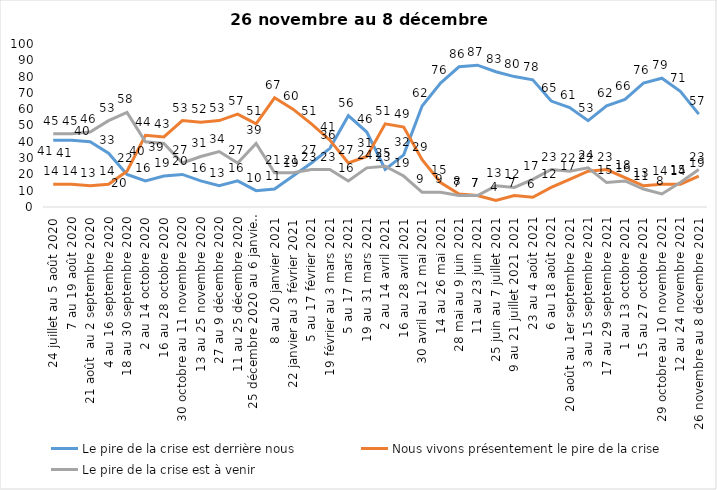
| Category | Le pire de la crise est derrière nous | Nous vivons présentement le pire de la crise | Le pire de la crise est à venir |
|---|---|---|---|
| 24 juillet au 5 août 2020 | 41 | 14 | 45 |
| 7 au 19 août 2020 | 41 | 14 | 45 |
| 21 août  au 2 septembre 2020 | 40 | 13 | 46 |
| 4 au 16 septembre 2020 | 33 | 14 | 53 |
| 18 au 30 septembre 2020 | 20 | 22 | 58 |
| 2 au 14 octobre 2020 | 16 | 44 | 40 |
| 16 au 28 octobre 2020 | 19 | 43 | 39 |
| 30 octobre au 11 novembre 2020 | 20 | 53 | 27 |
| 13 au 25 novembre 2020 | 16 | 52 | 31 |
| 27 au 9 décembre 2020 | 13 | 53 | 34 |
| 11 au 25 décembre 2020 | 16 | 57 | 27 |
| 25 décembre 2020 au 6 janvier 2021 | 10 | 51 | 39 |
| 8 au 20 janvier 2021 | 11 | 67 | 21 |
| 22 janvier au 3 février 2021 | 19 | 60 | 21 |
| 5 au 17 février 2021 | 27 | 51 | 23 |
| 19 février au 3 mars 2021 | 36 | 41 | 23 |
| 5 au 17 mars 2021 | 56 | 27 | 16 |
| 19 au 31 mars 2021 | 46 | 31 | 24 |
| 2 au 14 avril 2021 | 23 | 51 | 25 |
| 16 au 28 avril 2021 | 32 | 49 | 19 |
| 30 avril au 12 mai 2021 | 62 | 29 | 9 |
| 14 au 26 mai 2021 | 76 | 15 | 9 |
| 28 mai au 9 juin 2021 | 86 | 8 | 7 |
| 11 au 23 juin 2021 | 87 | 7 | 7 |
| 25 juin au 7 juillet 2021 | 83 | 4 | 13 |
| 9 au 21 juillet 2021 2021 | 80 | 7 | 12 |
| 23 au 4 août 2021 | 78 | 6 | 17 |
| 6 au 18 août 2021 | 65 | 12 | 23 |
| 20 août au 1er septembre 2021 | 61 | 17 | 22 |
| 3 au 15 septembre 2021 | 53 | 22 | 24 |
| 17 au 29 septembre 2021 | 62 | 23 | 15 |
| 1 au 13 octobre 2021 | 66 | 18 | 16 |
| 15 au 27 octobre 2021 | 76 | 13 | 11 |
| 29 octobre au 10 novembre 2021 | 79 | 14 | 8 |
| 12 au 24 novembre 2021 | 71 | 14 | 15 |
| 26 novembre au 8 décembre 2021 | 57 | 19 | 23 |